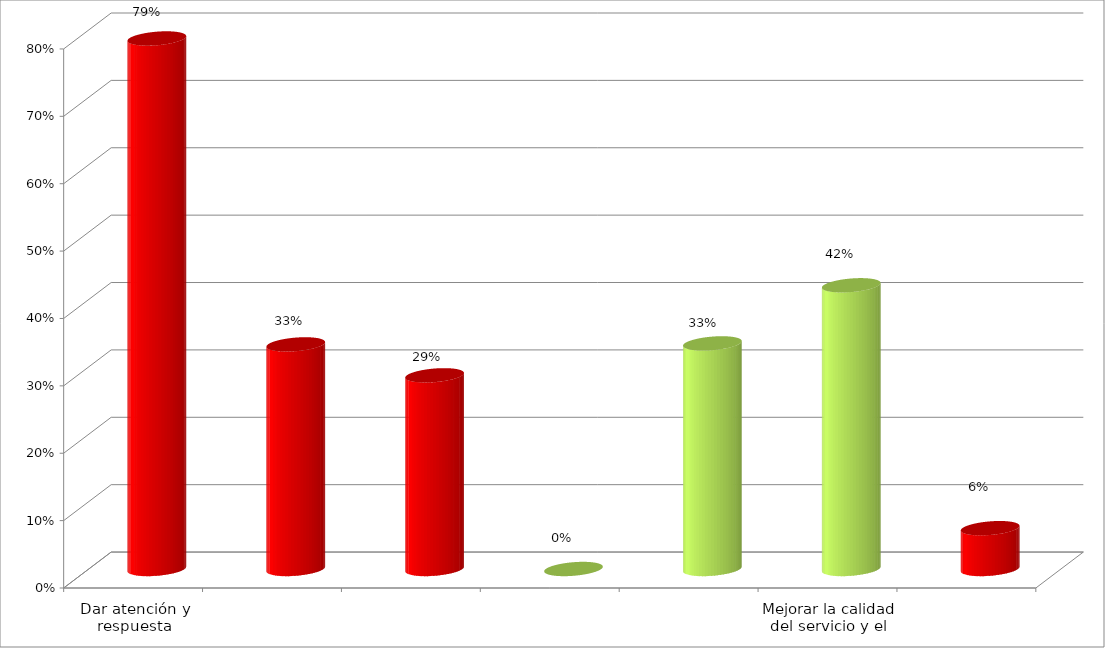
| Category | Series 0 |
|---|---|
| Dar atención y respuesta oportuna a las quejas, reclamos y consultas, formuladas por la ciudadania. | 0.787 |
| Formular, desarrollar y ejecutar, oportunamente, los proyectos de inversión de la entidad. | 0.333 |
| Supervisar las organizaciones de la economía solidaria, que estan bajo su competencia. | 0.287 |
| Mejorar los canales internos y externos de comunicación de la entidad. | 0 |
| Mantener el desempeño y la mejora continua del sistema integrado de gestión  | 0.335 |
| Mejorar la calidad del servicio y el medio ambiente fortaleciendo el Talento Humano. | 0.421 |
| Desarrollar programas de gestión que ayuden a prevenir la contaminación, a reducir y controlar los aspectos e impactos ambientales identificados | 0.061 |